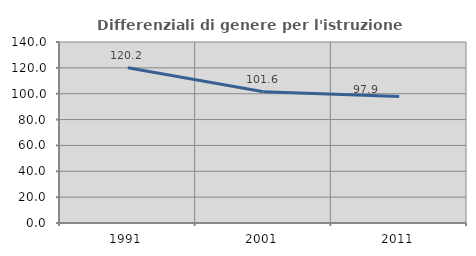
| Category | Differenziali di genere per l'istruzione superiore |
|---|---|
| 1991.0 | 120.159 |
| 2001.0 | 101.572 |
| 2011.0 | 97.909 |